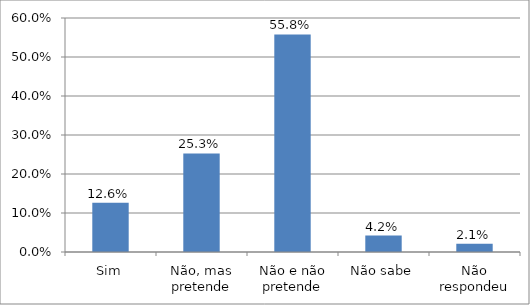
| Category | Series 0 |
|---|---|
| Sim | 0.126 |
| Não, mas pretende | 0.253 |
| Não e não pretende | 0.558 |
| Não sabe | 0.042 |
| Não respondeu | 0.021 |